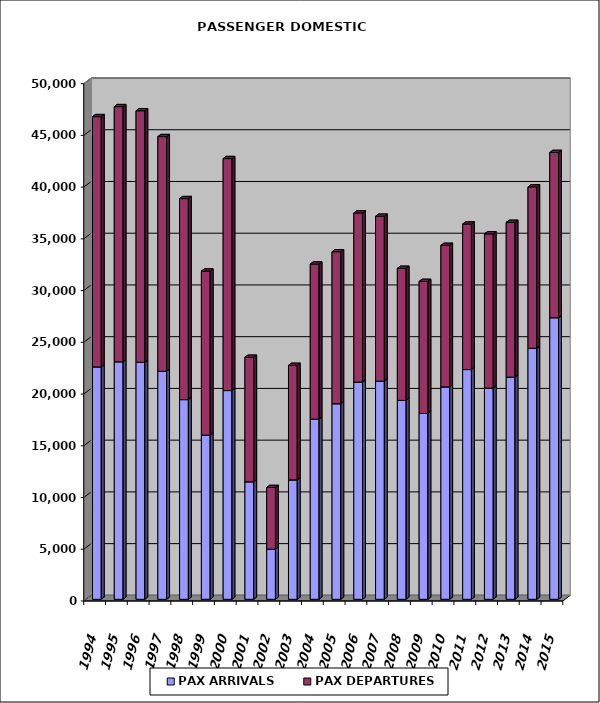
| Category | PAX ARRIVALS | PAX DEPARTURES |
|---|---|---|
| 1994.0 | 22463 | 24182 |
| 1995.0 | 22960 | 24654 |
| 1996.0 | 22904 | 24312 |
| 1997.0 | 22045 | 22672 |
| 1998.0 | 19300 | 19424 |
| 1999.0 | 15866 | 15856 |
| 2000.0 | 20175 | 22417 |
| 2001.0 | 11357 | 12031 |
| 2002.0 | 4842 | 5963 |
| 2003.0 | 11545 | 11064 |
| 2004.0 | 17413 | 14988 |
| 2005.0 | 18903 | 14684 |
| 2006.0 | 20995 | 16344 |
| 2007.0 | 21079 | 15938 |
| 2008.0 | 19226 | 12760 |
| 2009.0 | 17959 | 12763 |
| 2010.0 | 20532 | 13672 |
| 2011.0 | 22205 | 14066 |
| 2012.0 | 20417 | 14894 |
| 2013.0 | 21475 | 14954 |
| 2014.0 | 24259 | 15600 |
| 2015.0 | 27218 | 15964 |